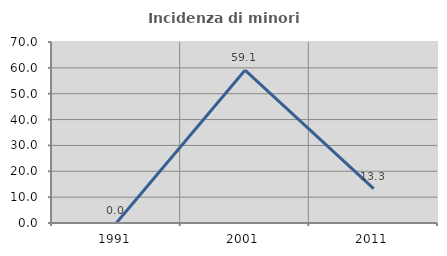
| Category | Incidenza di minori stranieri |
|---|---|
| 1991.0 | 0 |
| 2001.0 | 59.091 |
| 2011.0 | 13.333 |